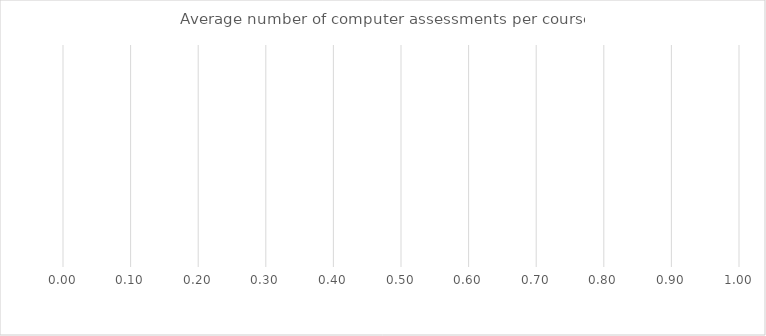
| Category | Benchmark | Entire LEA  | Title IV-A Identified Schools |
|---|---|---|---|
| Average number of computer assessments per course | 0 | 0 | 0 |